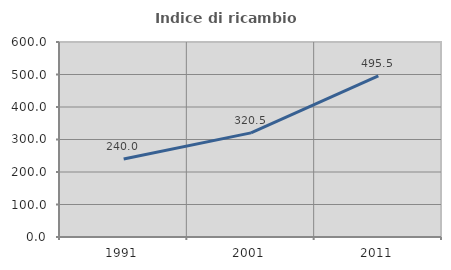
| Category | Indice di ricambio occupazionale  |
|---|---|
| 1991.0 | 240.046 |
| 2001.0 | 320.473 |
| 2011.0 | 495.537 |